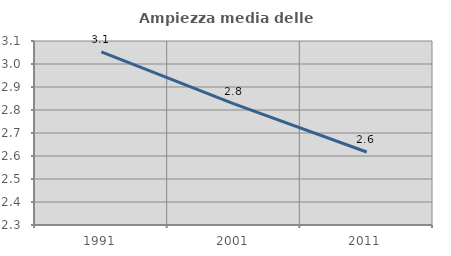
| Category | Ampiezza media delle famiglie |
|---|---|
| 1991.0 | 3.053 |
| 2001.0 | 2.826 |
| 2011.0 | 2.617 |